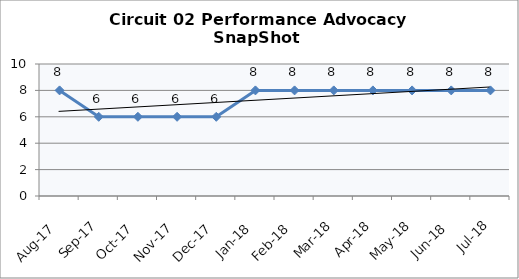
| Category | Circuit 02 |
|---|---|
| Aug-17 | 8 |
| Sep-17 | 6 |
| Oct-17 | 6 |
| Nov-17 | 6 |
| Dec-17 | 6 |
| Jan-18 | 8 |
| Feb-18 | 8 |
| Mar-18 | 8 |
| Apr-18 | 8 |
| May-18 | 8 |
| Jun-18 | 8 |
| Jul-18 | 8 |